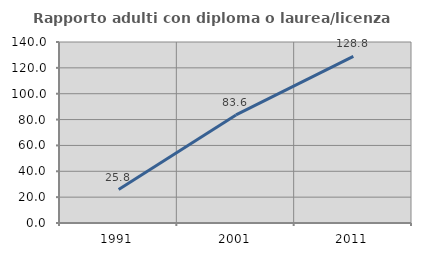
| Category | Rapporto adulti con diploma o laurea/licenza media  |
|---|---|
| 1991.0 | 25.828 |
| 2001.0 | 83.596 |
| 2011.0 | 128.819 |